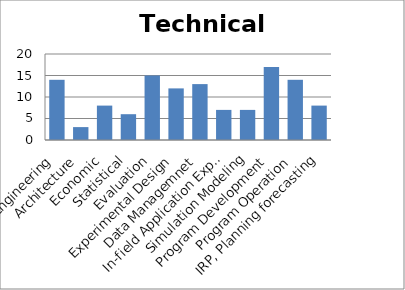
| Category | Technical Expertise |
|---|---|
| Engineering | 14 |
| Architecture | 3 |
| Economic | 8 |
| Statistical | 6 |
| Evaluation | 15 |
| Experimental Design | 12 |
| Data Managemnet | 13 |
| In-field Application Experience | 7 |
| Simulation Modeling | 7 |
| Program Development | 17 |
| Program Operation | 14 |
| IRP, Planning forecasting | 8 |